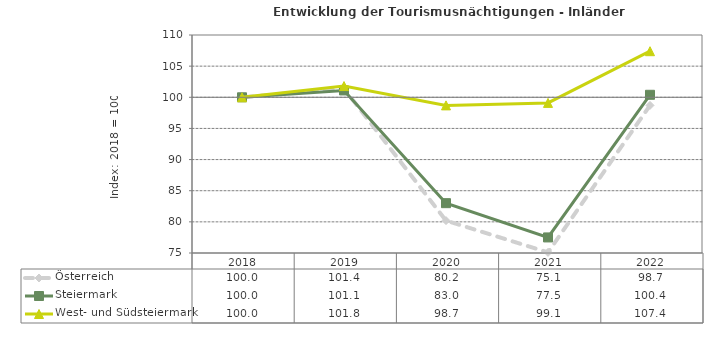
| Category | Österreich | Steiermark | West- und Südsteiermark |
|---|---|---|---|
| 2022.0 | 98.7 | 100.4 | 107.4 |
| 2021.0 | 75.1 | 77.5 | 99.1 |
| 2020.0 | 80.2 | 83 | 98.7 |
| 2019.0 | 101.4 | 101.1 | 101.8 |
| 2018.0 | 100 | 100 | 100 |